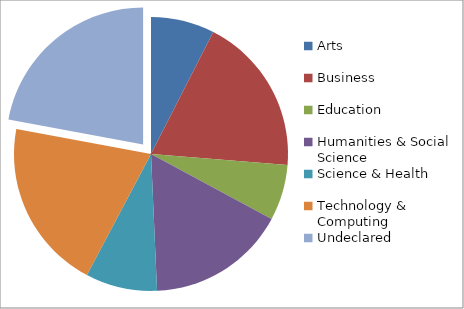
| Category | Series 0 |
|---|---|
| Arts | 1600 |
| Business | 4000 |
| Education | 1400 |
| Humanities & Social Science | 3500 |
| Science & Health | 1800 |
| Technology & Computing | 4300 |
| Undeclared | 4700 |